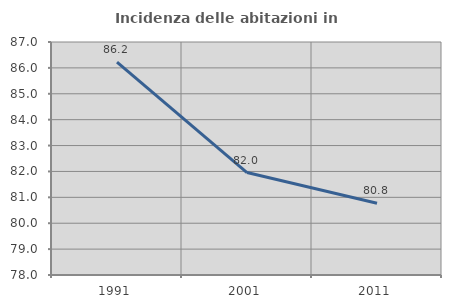
| Category | Incidenza delle abitazioni in proprietà  |
|---|---|
| 1991.0 | 86.224 |
| 2001.0 | 81.958 |
| 2011.0 | 80.769 |